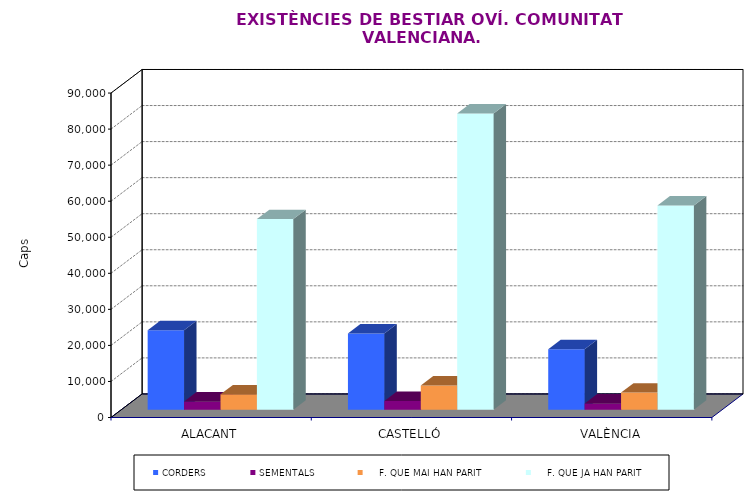
| Category | CORDERS | SEMENTALS |     F. QUE MAI HAN PARIT |     F. QUE JA HAN PARIT |
|---|---|---|---|---|
| ALACANT | 22063 | 2272 | 4255 | 52872 |
| CASTELLÓ | 21170 | 2424 | 6740 | 82193 |
| VALÈNCIA | 16772 | 1755 | 4741 | 56647 |